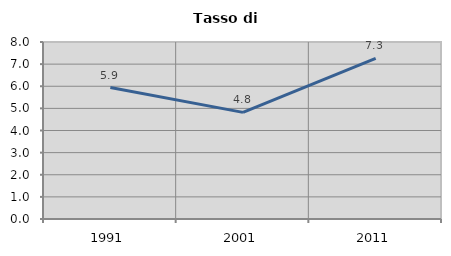
| Category | Tasso di disoccupazione   |
|---|---|
| 1991.0 | 5.94 |
| 2001.0 | 4.818 |
| 2011.0 | 7.26 |